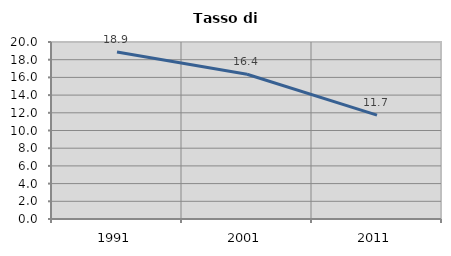
| Category | Tasso di disoccupazione   |
|---|---|
| 1991.0 | 18.866 |
| 2001.0 | 16.352 |
| 2011.0 | 11.741 |